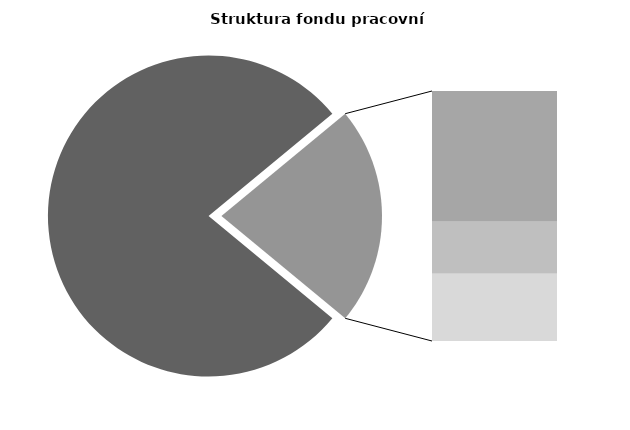
| Category | Series 0 |
|---|---|
| Průměrná měsíční odpracovaná doba bez přesčasu | 133.987 |
| Dovolená | 19.766 |
| Nemoc | 7.82 |
| Jiné | 10.176 |